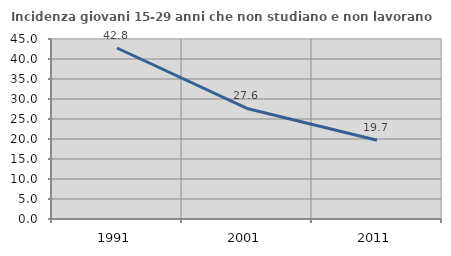
| Category | Incidenza giovani 15-29 anni che non studiano e non lavorano  |
|---|---|
| 1991.0 | 42.754 |
| 2001.0 | 27.642 |
| 2011.0 | 19.672 |